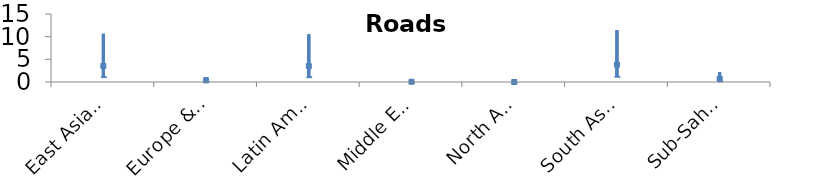
| Category | Worst | Best | Central |
|---|---|---|---|
| East Asia & Pacific | 10.637 | 1.182 | 3.546 |
| Europe & Central Asia | 1.064 | 0.118 | 0.355 |
| Latin America & Caribbean | 10.497 | 1.166 | 3.499 |
| Middle East & North Africa | 0.153 | 0.017 | 0.051 |
| North America | 0 | 0 | 0 |
| South Asia | 11.436 | 1.271 | 3.812 |
| Sub-Saharan Africa | 2.163 | 0.24 | 0.721 |